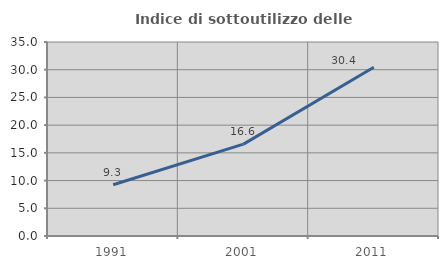
| Category | Indice di sottoutilizzo delle abitazioni  |
|---|---|
| 1991.0 | 9.25 |
| 2001.0 | 16.582 |
| 2011.0 | 30.447 |